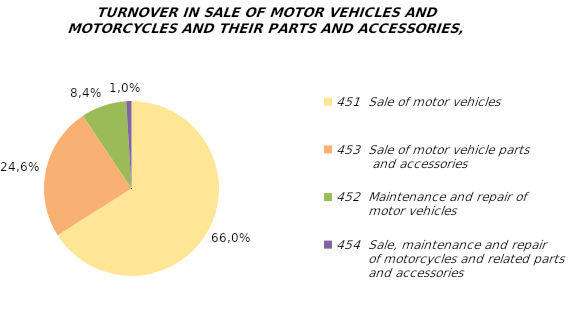
| Category | Series 0 |
|---|---|
| 451  Sale of motor vehicles | 66.015 |
| 453  Sale of motor vehicle parts 
         and accessories | 24.624 |
| 452  Maintenance and repair of 
        motor vehicles | 8.398 |
| 454  Sale, maintenance and repair 
        of motorcycles and related parts 
        and accessories | 0.963 |